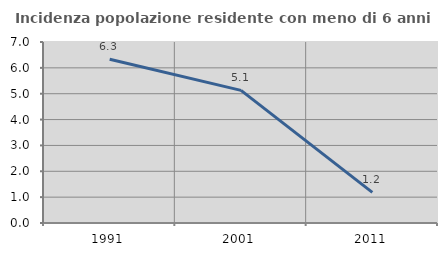
| Category | Incidenza popolazione residente con meno di 6 anni |
|---|---|
| 1991.0 | 6.335 |
| 2001.0 | 5.128 |
| 2011.0 | 1.183 |